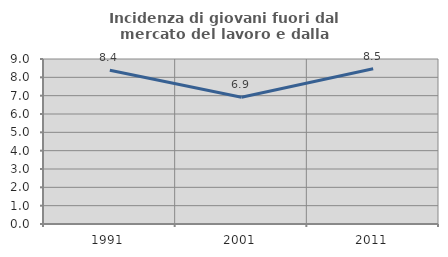
| Category | Incidenza di giovani fuori dal mercato del lavoro e dalla formazione  |
|---|---|
| 1991.0 | 8.382 |
| 2001.0 | 6.914 |
| 2011.0 | 8.464 |